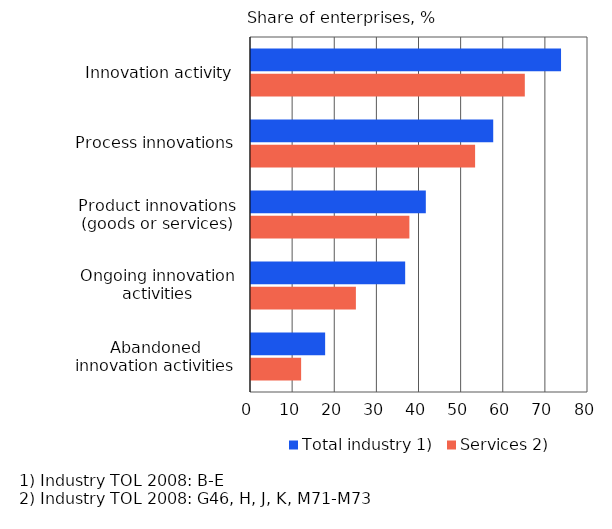
| Category | Total industry 1) | Services 2) |
|---|---|---|
| Innovation activity | 73.6 | 65 |
| Process innovations | 57.5 | 53.2 |
| Product innovations (goods or services) | 41.5 | 37.6 |
| Ongoing innovation activities | 36.6 | 24.9 |
| Abandoned innovation activities | 17.6 | 11.9 |